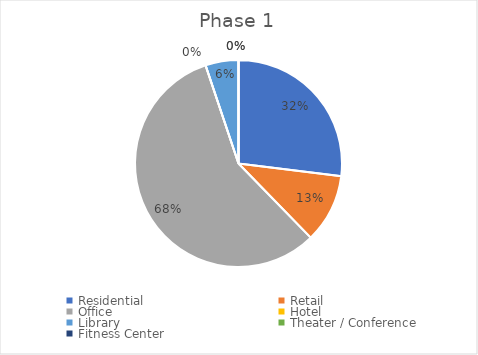
| Category | Series 0 |
|---|---|
| Residential | 0.32 |
| Retail | 0.128 |
| Office | 0.679 |
| Hotel | 0 |
| Library | 0.061 |
| Theater / Conference | 0 |
| Fitness Center | 0 |